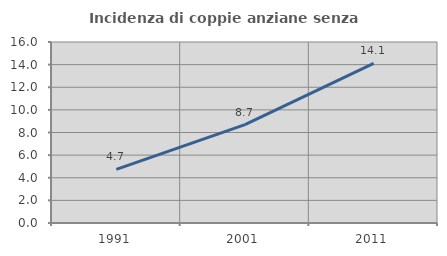
| Category | Incidenza di coppie anziane senza figli  |
|---|---|
| 1991.0 | 4.744 |
| 2001.0 | 8.698 |
| 2011.0 | 14.106 |